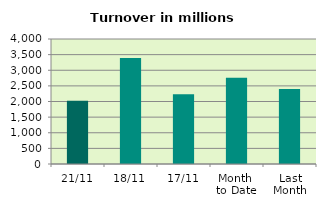
| Category | Series 0 |
|---|---|
| 21/11 | 2024.599 |
| 18/11 | 3393.156 |
| 17/11 | 2232.924 |
| Month 
to Date | 2759.267 |
| Last
Month | 2399.244 |